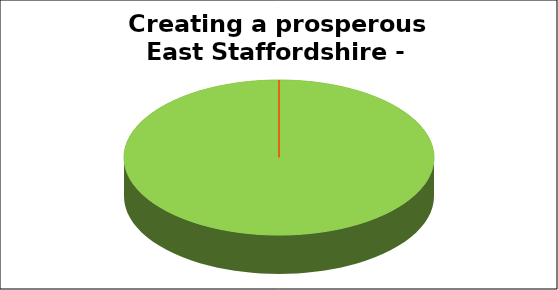
| Category | Series 0 |
|---|---|
| Green | 1 |
| Amber | 0 |
| Red | 0 |